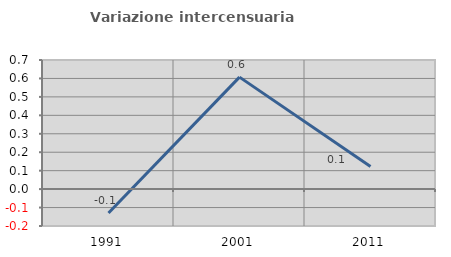
| Category | Variazione intercensuaria annua |
|---|---|
| 1991.0 | -0.129 |
| 2001.0 | 0.607 |
| 2011.0 | 0.123 |